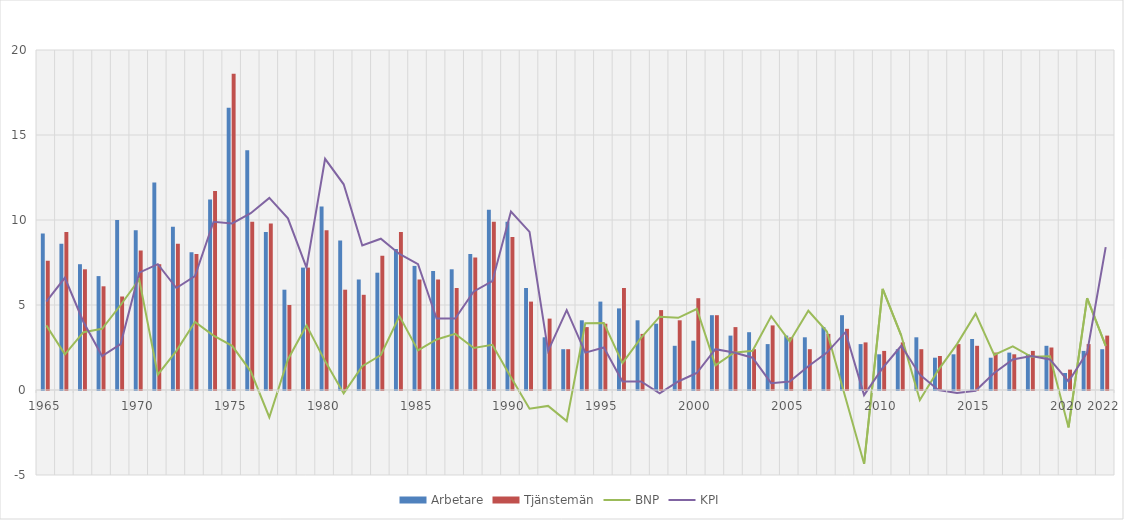
| Category | Arbetare | Tjänstemän |
|---|---|---|
| 1965 | 9.2 | 7.6 |
|  | 8.6 | 9.3 |
|  | 7.4 | 7.1 |
|  | 6.7 | 6.1 |
|  | 10 | 5.5 |
| 1970 | 9.4 | 8.2 |
|  | 12.2 | 7.4 |
|  | 9.6 | 8.6 |
|  | 8.1 | 8 |
|  | 11.2 | 11.7 |
| 1975 | 16.6 | 18.6 |
|  | 14.1 | 9.9 |
|  | 9.3 | 9.8 |
|  | 5.9 | 5 |
|  | 7.2 | 7.2 |
| 1980 | 10.8 | 9.4 |
|  | 8.8 | 5.9 |
|  | 6.5 | 5.6 |
|  | 6.9 | 7.9 |
|  | 8.3 | 9.3 |
| 1985 | 7.3 | 6.5 |
|  | 7 | 6.5 |
|  | 7.1 | 6 |
|  | 8 | 7.8 |
|  | 10.6 | 9.9 |
| 1990 | 9.9 | 9 |
|  | 6 | 5.2 |
|  | 3.1 | 4.2 |
|  | 2.4 | 2.4 |
|  | 4.1 | 3.7 |
| 1995 | 5.2 | 3.9 |
|  | 4.8 | 6 |
|  | 4.1 | 3.3 |
|  | 3.9 | 4.7 |
|  | 2.6 | 4.1 |
| 2000 | 2.9 | 5.4 |
|  | 4.4 | 4.4 |
|  | 3.2 | 3.7 |
|  | 3.4 | 2.4 |
|  | 2.7 | 3.8 |
| 2005 | 3.2 | 3.1 |
|  | 3.1 | 2.4 |
|  | 3.7 | 3.3 |
|  | 4.4 | 3.6 |
|  | 2.7 | 2.8 |
| 2010 | 2.1 | 2.3 |
|  | 2.4 | 2.8 |
|  | 3.1 | 2.4 |
|  | 1.9 | 2 |
|  | 2.1 | 2.7 |
| 2015 | 3 | 2.6 |
|  | 1.9 | 2.2 |
|  | 2.2 | 2.1 |
|  | 2.1 | 2.3 |
|  | 2.6 | 2.5 |
| 2020 | 1 | 1.2 |
|  | 2.3 | 2.7 |
| 2022 | 2.4 | 3.2 |